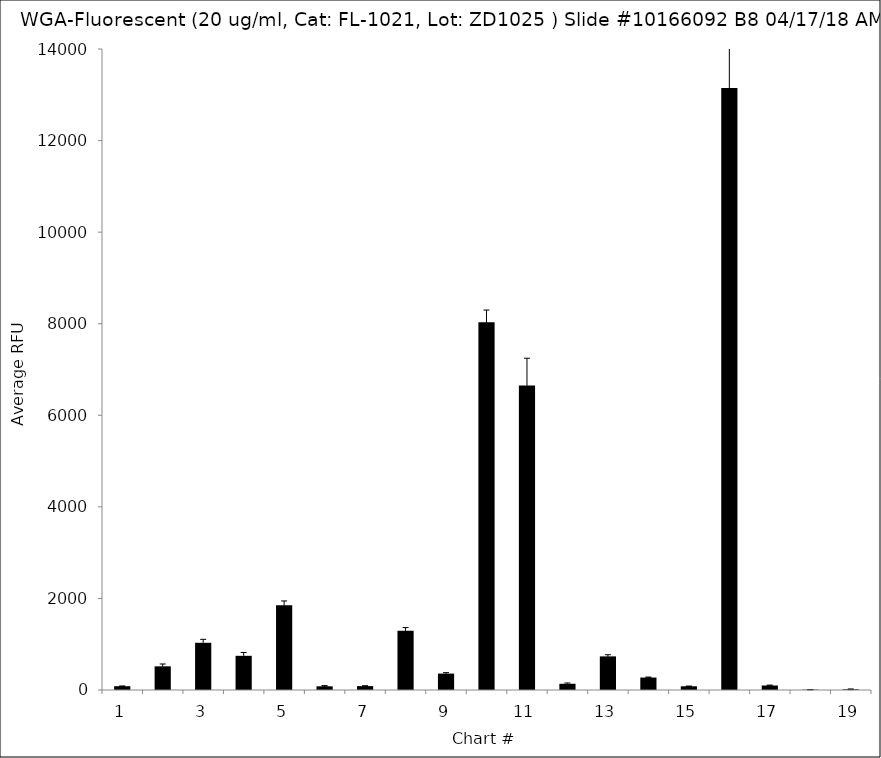
| Category | Series 0 |
|---|---|
| 1.0 | 82.75 |
| 2.0 | 517 |
| 3.0 | 1031 |
| 4.0 | 746.5 |
| 5.0 | 1852.25 |
| 6.0 | 80.5 |
| 7.0 | 85 |
| 8.0 | 1292.5 |
| 9.0 | 358.5 |
| 10.0 | 8031.75 |
| 11.0 | 6649.75 |
| 12.0 | 136 |
| 13.0 | 734.25 |
| 14.0 | 272.25 |
| 15.0 | 81.25 |
| 16.0 | 13146.75 |
| 17.0 | 98.25 |
| 18.0 | 7 |
| 19.0 | 15.25 |